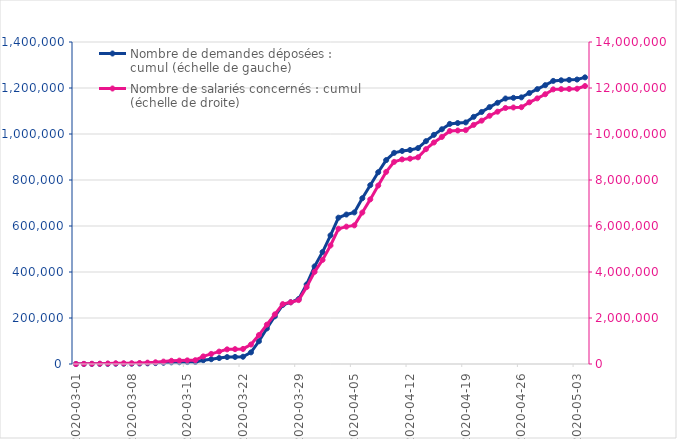
| Category | Nombre de demandes déposées : cumul (échelle de gauche) |
|---|---|
| 2020-03-01 | 1 |
| 2020-03-02 | 130 |
| 2020-03-03 | 296 |
| 2020-03-04 | 498 |
| 2020-03-05 | 807 |
| 2020-03-06 | 1286 |
| 2020-03-07 | 1311 |
| 2020-03-08 | 1328 |
| 2020-03-09 | 1965 |
| 2020-03-10 | 2817 |
| 2020-03-11 | 3932 |
| 2020-03-12 | 5487 |
| 2020-03-13 | 7271 |
| 2020-03-14 | 7738 |
| 2020-03-15 | 8388 |
| 2020-03-16 | 8713 |
| 2020-03-17 | 16214 |
| 2020-03-18 | 20776 |
| 2020-03-19 | 25825 |
| 2020-03-20 | 30071 |
| 2020-03-21 | 30722 |
| 2020-03-22 | 31537 |
| 2020-03-23 | 50545 |
| 2020-03-24 | 98741 |
| 2020-03-25 | 154595 |
| 2020-03-26 | 207388 |
| 2020-03-27 | 256780 |
| 2020-03-28 | 268394 |
| 2020-03-29 | 282563 |
| 2020-03-30 | 345763 |
| 2020-03-31 | 424373 |
| 2020-04-01 | 486832 |
| 2020-04-02 | 559312 |
| 2020-04-03 | 636147 |
| 2020-04-04 | 649830 |
| 2020-04-05 | 659027 |
| 2020-04-06 | 720671 |
| 2020-04-07 | 777541 |
| 2020-04-08 | 833827 |
| 2020-04-09 | 886572 |
| 2020-04-10 | 918048 |
| 2020-04-11 | 926246 |
| 2020-04-12 | 930435 |
| 2020-04-13 | 938658 |
| 2020-04-14 | 968778 |
| 2020-04-15 | 996285 |
| 2020-04-16 | 1020577 |
| 2020-04-17 | 1043939 |
| 2020-04-18 | 1047609 |
| 2020-04-19 | 1050345 |
| 2020-04-20 | 1074590 |
| 2020-04-21 | 1095733 |
| 2020-04-22 | 1116897 |
| 2020-04-23 | 1135709 |
| 2020-04-24 | 1154253 |
| 2020-04-25 | 1157245 |
| 2020-04-26 | 1159254 |
| 2020-04-27 | 1178037 |
| 2020-04-28 | 1195193 |
| 2020-04-29 | 1212345 |
| 2020-04-30 | 1230839 |
| 2020-05-01 | 1233505 |
| 2020-05-02 | 1235323 |
| 2020-05-03 | 1236821 |
| 2020-05-04 | 1246282 |